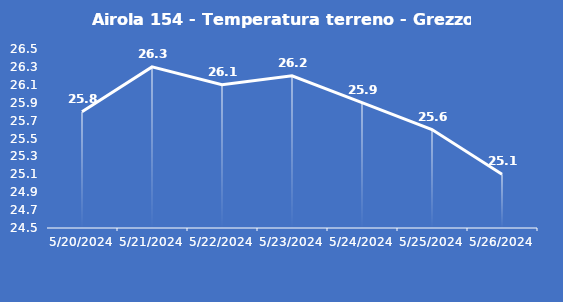
| Category | Airola 154 - Temperatura terreno - Grezzo (°C) |
|---|---|
| 5/20/24 | 25.8 |
| 5/21/24 | 26.3 |
| 5/22/24 | 26.1 |
| 5/23/24 | 26.2 |
| 5/24/24 | 25.9 |
| 5/25/24 | 25.6 |
| 5/26/24 | 25.1 |